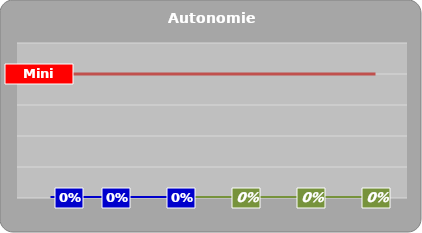
| Category | Series 0 | Mini |
|---|---|---|
|   | 0 | 0.2 |
|   | 0 | 0.2 |
|   | 0 | 0.2 |
|   | 0 | 0.2 |
|   | 0 | 0.2 |
|   | 0 | 0.2 |